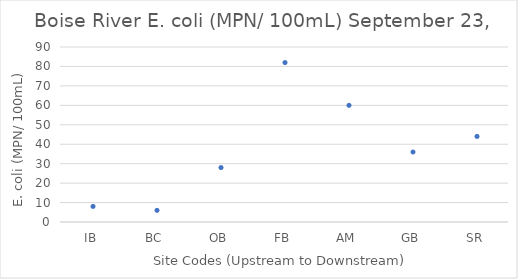
| Category | E. coli (MPN/ 100mL) |
|---|---|
| IB | 8 |
| BC | 6 |
| OB | 28 |
| FB | 82 |
| AM | 60 |
| GB | 36 |
| SR | 44 |